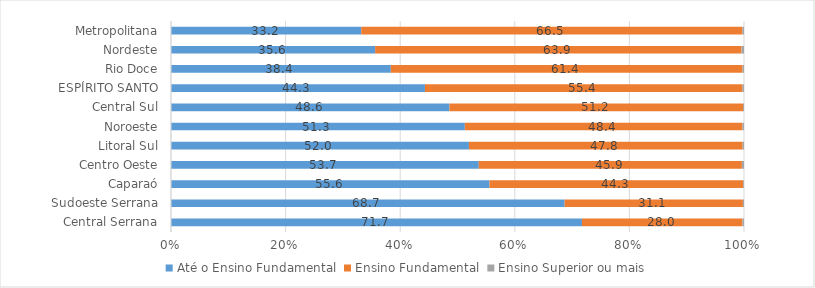
| Category | Até o Ensino Fundamental | Ensino Fundamental | Ensino Superior ou mais |
|---|---|---|---|
| Central Serrana | 71.725 | 28.001 | 0.274 |
| Sudoeste Serrana | 68.699 | 31.107 | 0.194 |
| Caparaó | 55.587 | 44.29 | 0.124 |
| Centro Oeste | 53.714 | 45.919 | 0.367 |
| Litoral Sul | 51.999 | 47.757 | 0.244 |
| Noroeste | 51.281 | 48.442 | 0.276 |
| Central Sul | 48.601 | 51.227 | 0.172 |
| ESPÍRITO SANTO | 44.323 | 55.396 | 0.281 |
| Rio Doce | 38.361 | 61.389 | 0.25 |
| Nordeste | 35.626 | 63.939 | 0.436 |
| Metropolitana | 33.201 | 66.503 | 0.296 |